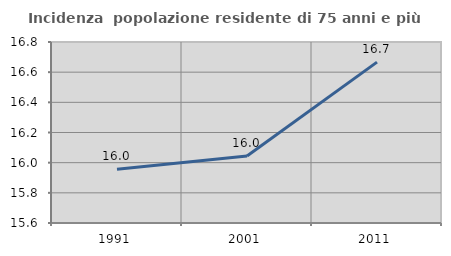
| Category | Incidenza  popolazione residente di 75 anni e più |
|---|---|
| 1991.0 | 15.956 |
| 2001.0 | 16.044 |
| 2011.0 | 16.667 |